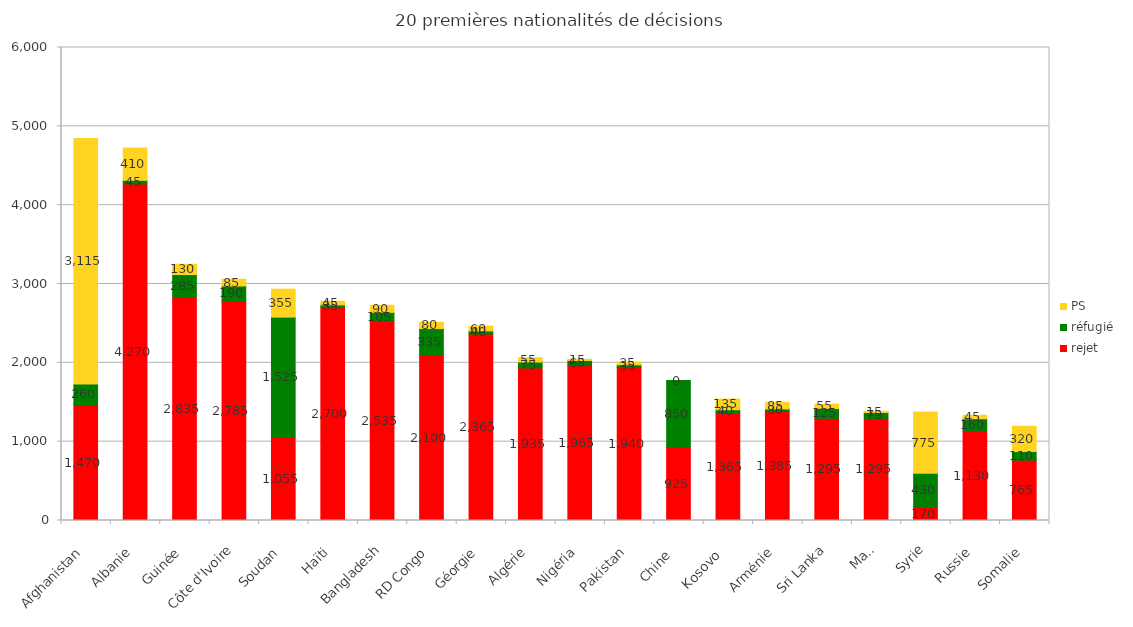
| Category | rejet | réfugié | PS |
|---|---|---|---|
| Afghanistan | 1470 | 260 | 3115 |
| Albanie | 4270 | 45 | 410 |
| Guinée | 2835 | 285 | 130 |
| Côte d'Ivoire | 2785 | 190 | 85 |
| Soudan | 1055 | 1525 | 355 |
| Haïti | 2700 | 35 | 45 |
| Bangladesh | 2535 | 105 | 90 |
| RD Congo | 2100 | 335 | 80 |
| Géorgie | 2365 | 40 | 60 |
| Algérie | 1935 | 75 | 55 |
| Nigéria | 1965 | 65 | 15 |
| Pakistan | 1940 | 35 | 35 |
| Chine  | 925 | 850 | 0 |
| Kosovo  | 1365 | 40 | 135 |
| Arménie | 1385 | 30 | 85 |
| Sri Lanka | 1295 | 125 | 55 |
| Mali | 1295 | 75 | 15 |
| Syrie | 170 | 430 | 775 |
| Russie | 1130 | 160 | 45 |
| Somalie | 765 | 110 | 320 |